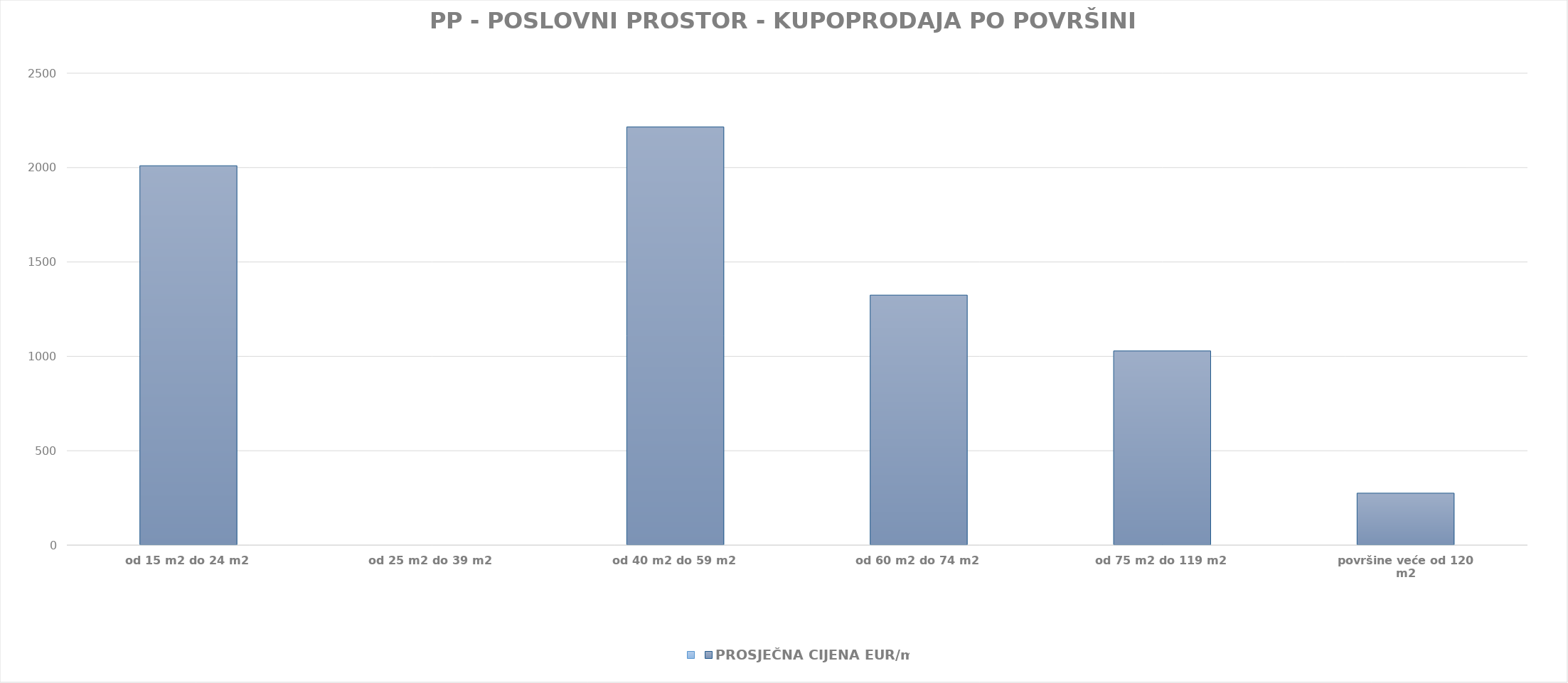
| Category | Series 0 | PROSJEČNA CIJENA EUR/m2 |
|---|---|---|
| od 15 m2 do 24 m2 |  | 1905-07-01 19:06:11 |
| od 25 m2 do 39 m2 |  | 0 |
| od 40 m2 do 59 m2 |  | 1906-01-23 04:31:57 |
| od 60 m2 do 74 m2 |  | 1903-08-16 11:18:40 |
| od 75 m2 do 119 m2 |  | 1902-10-24 16:26:06 |
| površine veće od 120 m2 |  | 1900-10-01 07:17:20 |